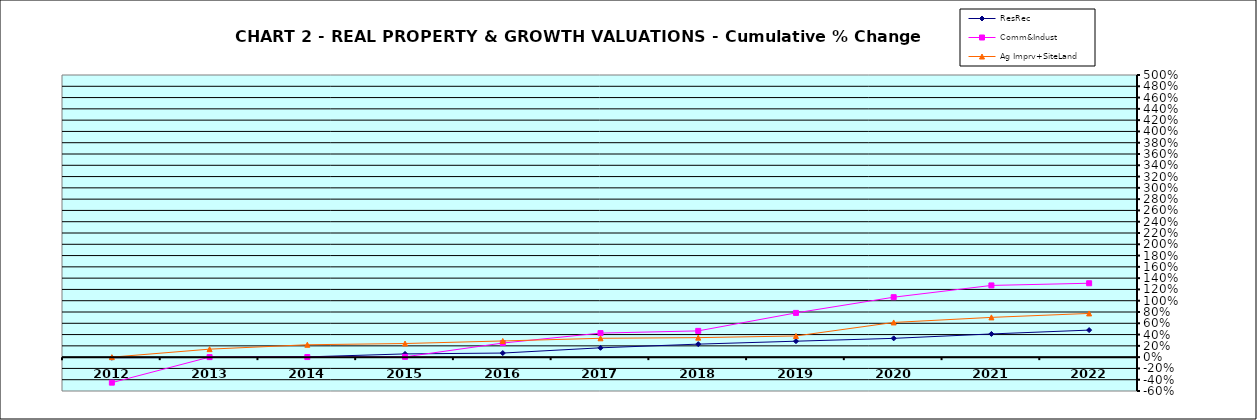
| Category | ResRec | Comm&Indust | Ag Imprv+SiteLand |
|---|---|---|---|
| 2012.0 | -0.01 | -0.452 | 0 |
| 2013.0 | -0.006 | 0 | 0.142 |
| 2014.0 | 0.005 | 0.001 | 0.22 |
| 2015.0 | 0.057 | 0.005 | 0.241 |
| 2016.0 | 0.072 | 0.25 | 0.287 |
| 2017.0 | 0.166 | 0.426 | 0.334 |
| 2018.0 | 0.231 | 0.465 | 0.346 |
| 2019.0 | 0.283 | 0.784 | 0.375 |
| 2020.0 | 0.333 | 1.062 | 0.615 |
| 2021.0 | 0.411 | 1.271 | 0.705 |
| 2022.0 | 0.479 | 1.31 | 0.775 |